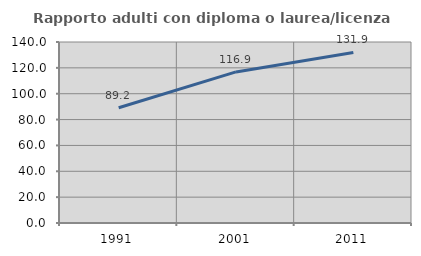
| Category | Rapporto adulti con diploma o laurea/licenza media  |
|---|---|
| 1991.0 | 89.174 |
| 2001.0 | 116.859 |
| 2011.0 | 131.94 |